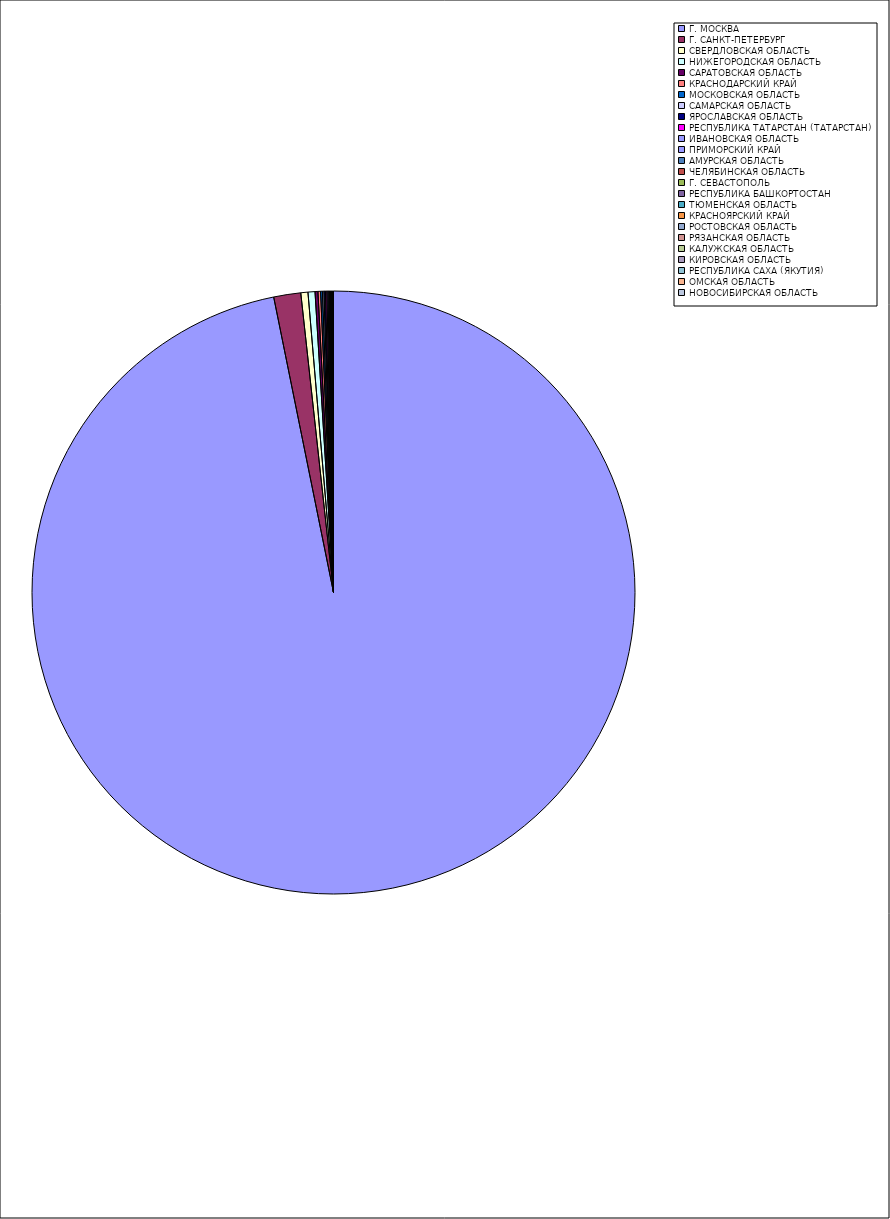
| Category | Оборот |
|---|---|
| Г. МОСКВА | 96.765 |
| Г. САНКТ-ПЕТЕРБУРГ | 1.447 |
| СВЕРДЛОВСКАЯ ОБЛАСТЬ | 0.381 |
| НИЖЕГОРОДСКАЯ ОБЛАСТЬ | 0.374 |
| САРАТОВСКАЯ ОБЛАСТЬ | 0.155 |
| КРАСНОДАРСКИЙ КРАЙ | 0.138 |
| МОСКОВСКАЯ ОБЛАСТЬ | 0.096 |
| САМАРСКАЯ ОБЛАСТЬ | 0.08 |
| ЯРОСЛАВСКАЯ ОБЛАСТЬ | 0.08 |
| РЕСПУБЛИКА ТАТАРСТАН (ТАТАРСТАН) | 0.073 |
| ИВАНОВСКАЯ ОБЛАСТЬ | 0.059 |
| ПРИМОРСКИЙ КРАЙ | 0.051 |
| АМУРСКАЯ ОБЛАСТЬ | 0.04 |
| ЧЕЛЯБИНСКАЯ ОБЛАСТЬ | 0.035 |
| Г. СЕВАСТОПОЛЬ | 0.025 |
| РЕСПУБЛИКА БАШКОРТОСТАН | 0.023 |
| ТЮМЕНСКАЯ ОБЛАСТЬ | 0.021 |
| КРАСНОЯРСКИЙ КРАЙ | 0.016 |
| РОСТОВСКАЯ ОБЛАСТЬ | 0.015 |
| РЯЗАНСКАЯ ОБЛАСТЬ | 0.014 |
| КАЛУЖСКАЯ ОБЛАСТЬ | 0.014 |
| КИРОВСКАЯ ОБЛАСТЬ | 0.014 |
| РЕСПУБЛИКА САХА (ЯКУТИЯ) | 0.011 |
| ОМСКАЯ ОБЛАСТЬ | 0.009 |
| НОВОСИБИРСКАЯ ОБЛАСТЬ | 0.005 |